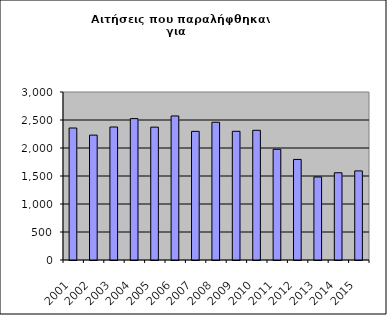
| Category | Series 1 |
|---|---|
| 2001.0 | 2357 |
| 2002.0 | 2230 |
| 2003.0 | 2375 |
| 2004.0 | 2525 |
| 2005.0 | 2372 |
| 2006.0 | 2572 |
| 2007.0 | 2297 |
| 2008.0 | 2460 |
| 2009.0 | 2298 |
| 2010.0 | 2316 |
| 2011.0 | 1977 |
| 2012.0 | 1796 |
| 2013.0 | 1483 |
| 2014.0 | 1558 |
| 2015.0 | 1591 |